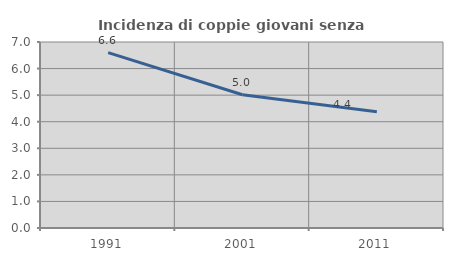
| Category | Incidenza di coppie giovani senza figli |
|---|---|
| 1991.0 | 6.601 |
| 2001.0 | 5.015 |
| 2011.0 | 4.372 |